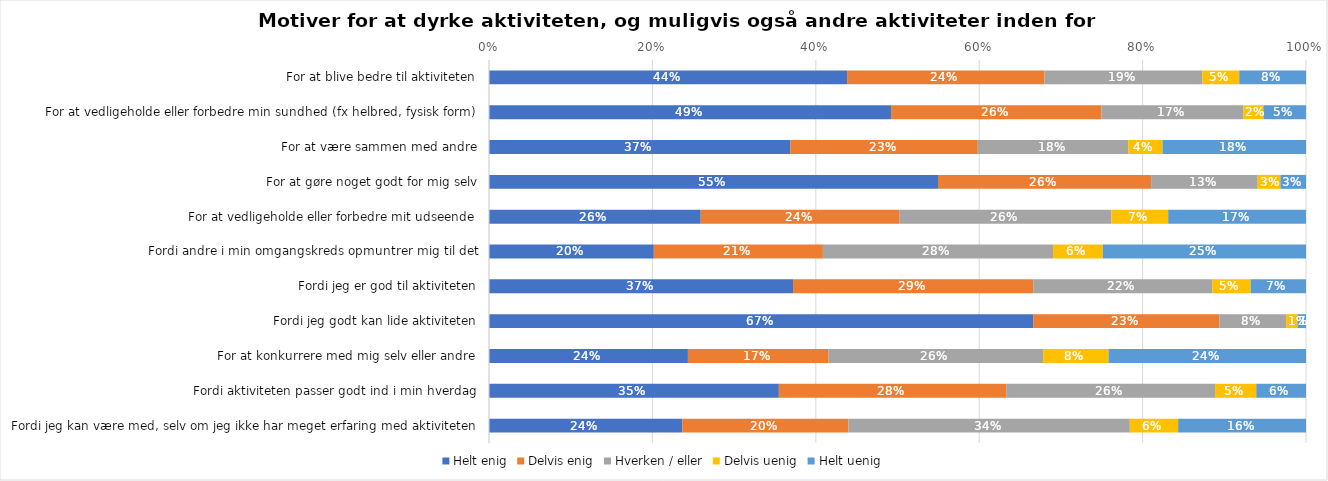
| Category | Helt enig | Delvis enig | Hverken / eller | Delvis uenig | Helt uenig |
|---|---|---|---|---|---|
| For at blive bedre til aktiviteten | 0.438 | 0.242 | 0.193 | 0.045 | 0.082 |
| For at vedligeholde eller forbedre min sundhed (fx helbred, fysisk form) | 0.492 | 0.257 | 0.174 | 0.024 | 0.052 |
| For at være sammen med andre | 0.369 | 0.23 | 0.184 | 0.042 | 0.176 |
| For at gøre noget godt for mig selv | 0.55 | 0.261 | 0.13 | 0.028 | 0.031 |
| For at vedligeholde eller forbedre mit udseende | 0.259 | 0.243 | 0.259 | 0.07 | 0.169 |
| Fordi andre i min omgangskreds opmuntrer mig til det | 0.202 | 0.207 | 0.282 | 0.061 | 0.249 |
| Fordi jeg er god til aktiviteten | 0.372 | 0.294 | 0.219 | 0.047 | 0.068 |
| Fordi jeg godt kan lide aktiviteten | 0.666 | 0.228 | 0.082 | 0.014 | 0.01 |
| For at konkurrere med mig selv eller andre | 0.243 | 0.172 | 0.263 | 0.08 | 0.242 |
| Fordi aktiviteten passer godt ind i min hverdag | 0.355 | 0.278 | 0.256 | 0.05 | 0.061 |
| Fordi jeg kan være med, selv om jeg ikke har meget erfaring med aktiviteten | 0.237 | 0.203 | 0.344 | 0.059 | 0.157 |